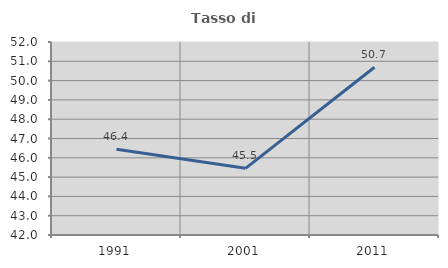
| Category | Tasso di occupazione   |
|---|---|
| 1991.0 | 46.446 |
| 2001.0 | 45.455 |
| 2011.0 | 50.691 |